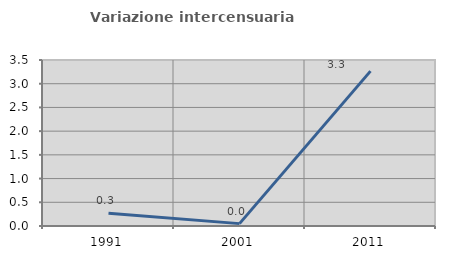
| Category | Variazione intercensuaria annua |
|---|---|
| 1991.0 | 0.268 |
| 2001.0 | 0.05 |
| 2011.0 | 3.266 |